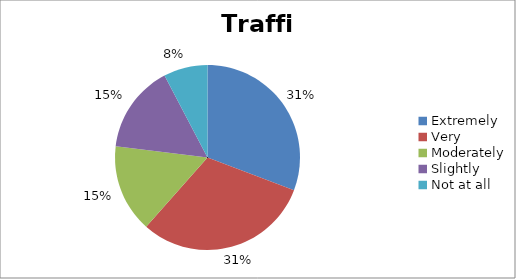
| Category | Traffic |
|---|---|
| Extremely | 4 |
| Very | 4 |
| Moderately | 2 |
| Slightly | 2 |
| Not at all | 1 |